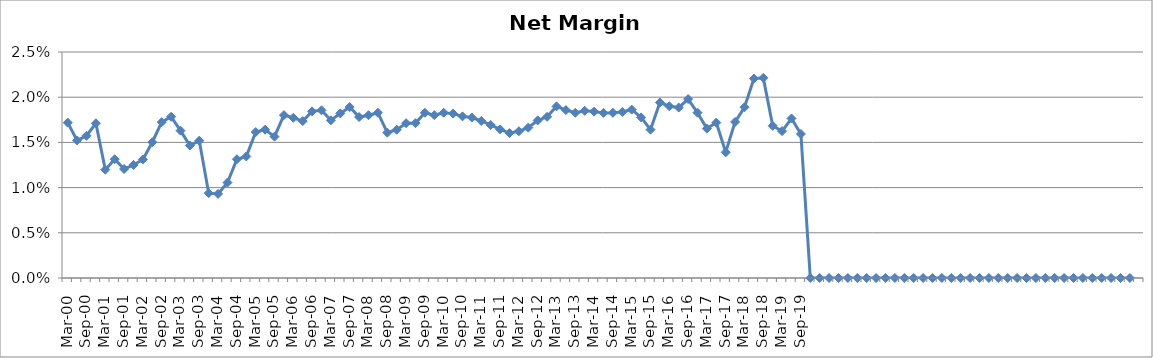
| Category | Series 0 |
|---|---|
| Mar-00 | 0.017 |
| Jun-00 | 0.015 |
| Sep-00 | 0.016 |
| Dec-00 | 0.017 |
| Mar-01 | 0.012 |
| Jun-01 | 0.013 |
| Sep-01 | 0.012 |
| Dec-01 | 0.013 |
| Mar-02 | 0.013 |
| Jun-02 | 0.015 |
| Sep-02 | 0.017 |
| Dec-02 | 0.018 |
| Mar-03 | 0.016 |
| Jun-03 | 0.015 |
| Sep-03 | 0.015 |
| Dec-03 | 0.009 |
| Mar-04 | 0.009 |
| Jun-04 | 0.011 |
| Sep-04 | 0.013 |
| Dec-04 | 0.013 |
| Mar-05 | 0.016 |
| Jun-05 | 0.016 |
| Sep-05 | 0.016 |
| Dec-05 | 0.018 |
| Mar-06 | 0.018 |
| Jun-06 | 0.017 |
| Sep-06 | 0.018 |
| Dec-06 | 0.019 |
| Mar-07 | 0.017 |
| Jun-07 | 0.018 |
| Sep-07 | 0.019 |
| Dec-07 | 0.018 |
| Mar-08 | 0.018 |
| Jun-08 | 0.018 |
| Sep-08 | 0.016 |
| Dec-08 | 0.016 |
| Mar-09 | 0.017 |
| Jun-09 | 0.017 |
| Sep-09 | 0.018 |
| Dec-09 | 0.018 |
| Mar-10 | 0.018 |
| Jun-10 | 0.018 |
| Sep-10 | 0.018 |
| Dec-10 | 0.018 |
| Mar-11 | 0.017 |
| Jun-11 | 0.017 |
| Sep-11 | 0.016 |
| Dec-11 | 0.016 |
| Mar-12 | 0.016 |
| Jun-12 | 0.017 |
| Sep-12 | 0.017 |
| Dec-12 | 0.018 |
| Mar-13 | 0.019 |
| Jun-13 | 0.019 |
| Sep-13 | 0.018 |
| Dec-13 | 0.018 |
| Mar-14 | 0.018 |
| Jun-14 | 0.018 |
| Sep-14 | 0.018 |
| Dec-14 | 0.018 |
| Mar-15 | 0.019 |
| Jun-15 | 0.018 |
| Sep-15 | 0.016 |
| Dec-15 | 0.019 |
| Mar-16 | 0.019 |
| Jun-16 | 0.019 |
| Sep-16 | 0.02 |
| Dec-16 | 0.018 |
| Mar-17 | 0.017 |
| Jun-17 | 0.017 |
| Sep-17 | 0.014 |
| Dec-17 | 0.017 |
| Mar-18 | 0.019 |
| Jun-18 | 0.022 |
| Sep-18 | 0.022 |
| Dec-18 | 0.017 |
| Mar-19 | 0.016 |
| Jun-19 | 0.018 |
| Sep-19 | 0.016 |